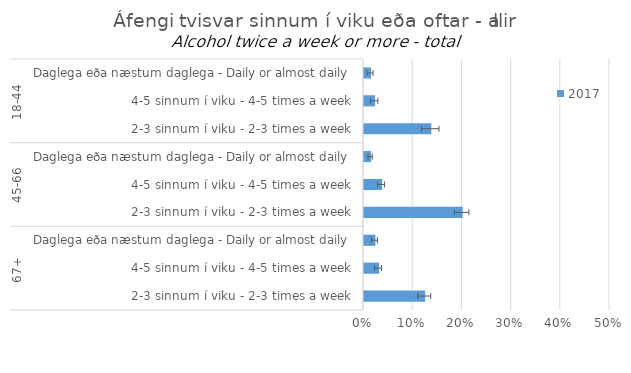
| Category | 2017 |
|---|---|
| 0 | 0.014 |
| 1 | 0.023 |
| 2 | 0.137 |
| 3 | 0.014 |
| 4 | 0.037 |
| 5 | 0.2 |
| 6 | 0.023 |
| 7 | 0.031 |
| 8 | 0.124 |